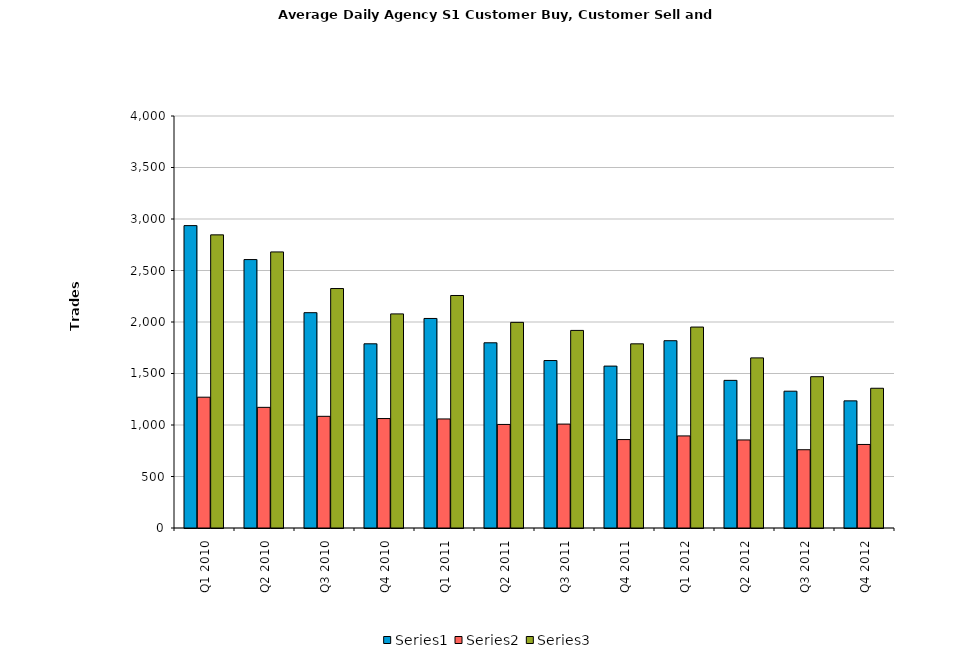
| Category | Series 0 | Series 1 | Series 2 |
|---|---|---|---|
| Q1 2010 | 2935.739 | 1270 | 2845.957 |
| Q2 2010 | 2606.111 | 1171.286 | 2680.349 |
| Q3 2010 | 2090.5 | 1084.203 | 2324.938 |
| Q4 2010 | 1788.234 | 1062.766 | 2078.609 |
| Q1 2011 | 2034.387 | 1058.839 | 2257.29 |
| Q2 2011 | 1798.238 | 1005.46 | 1996.54 |
| Q3 2011 | 1625.875 | 1008.922 | 1918.328 |
| Q4 2011 | 1571.873 | 858.524 | 1788.048 |
| Q1 2012 | 1818.403 | 893.984 | 1950.984 |
| Q2 2012 | 1433.317 | 854.921 | 1651.683 |
| Q3 2012 | 1328.175 | 759.905 | 1468.937 |
| Q4 2012 | 1234.317 | 811.079 | 1356.746 |